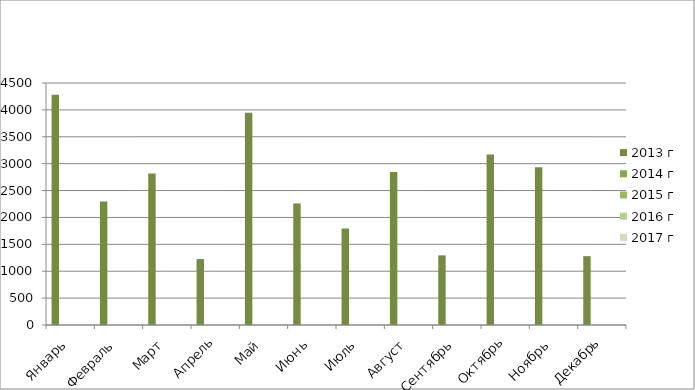
| Category | 2013 г | 2014 г | 2015 г | 2016 г | 2017 г |
|---|---|---|---|---|---|
| Январь  | 4280 | 0 | 0 | 0 | 0 |
| Февраль  | 2295 | 0 | 0 | 0 | 0 |
| Март | 2815 | 0 | 0 | 0 | 0 |
| Апрель | 1225 | 0 | 0 | 0 | 0 |
| Май | 3945 | 0 | 0 | 0 | 0 |
| Июнь | 2260 | 0 | 0 | 0 | 0 |
| Июль | 1795 | 0 | 0 | 0 | 0 |
| Август | 2845 | 0 | 0 | 0 | 0 |
| Сентябрь | 1295 | 0 | 0 | 0 | 0 |
| Октябрь | 3170 | 0 | 0 | 0 | 0 |
| Ноябрь | 2935 | 0 | 0 | 0 | 0 |
| Декабрь | 1280 | 0 | 0 | 0 | 0 |